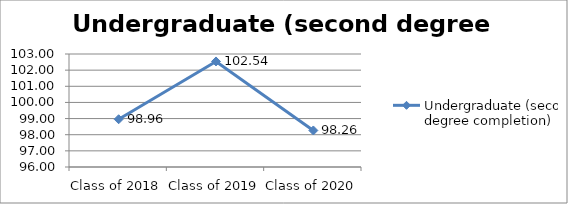
| Category | Undergraduate (second degree completion) |
|---|---|
| Class of 2018 | 98.958 |
| Class of 2019 | 102.538 |
| Class of 2020 | 98.264 |